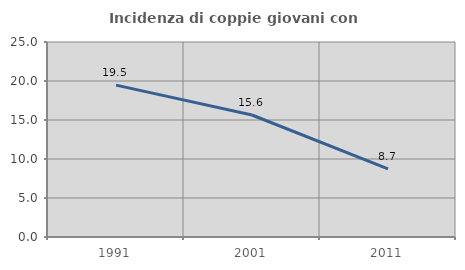
| Category | Incidenza di coppie giovani con figli |
|---|---|
| 1991.0 | 19.475 |
| 2001.0 | 15.639 |
| 2011.0 | 8.728 |